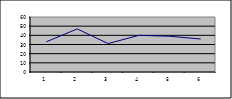
| Category | Series 0 |
|---|---|
| 0 | 33 |
| 1 | 47 |
| 2 | 31 |
| 3 | 40 |
| 4 | 39 |
| 5 | 36 |